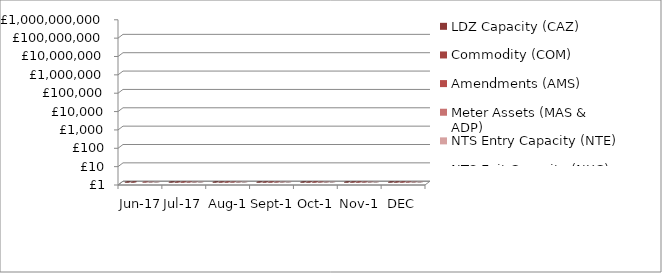
| Category | LDZ Capacity (CAZ) | Commodity (COM) | Amendments (AMS) | Meter Assets (MAS & ADP) | NTS Entry Capacity (NTE) | NTS Exit Capacity (NXC) |
|---|---|---|---|---|---|---|
| Jun-17 | 288773735.37 | 16487569.55 | -3258688.63 | 187370.3 | 2007422.43 | 22701563.13 |
| Jul-17 | 298593731.84 | 16897919.7 | 247176.37 | 193814.49 | 1970532.91 | 23462413.06 |
| Aug-17 | 298862406.46 | 16761360.58 | 1357290.74 | 193840.59 | 1969937.93 | 23465025.38 |
| Sep-17 | 289415948.74 | 20098400.73 | 205300.25 | 187587.95 | 1855267.92 | 22811559.53 |
| Oct-17 | 299201864.14 | 26855499.51 | 321543.98 | 193840.32 | 11176717.5 | 18097117.82 |
| Nov-17 | 290194555.87 | 41901625.24 | 281193.04 | 187587.95 | 12089719.21 | 18734838.83 |
| DEC | 299923728.54 | 49314715.49 | 486751.91 | 193840.34 | 12089719.21 | 18734838.83 |